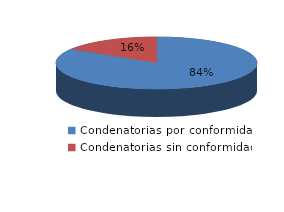
| Category | Series 0 |
|---|---|
| 0 | 764 |
| 1 | 147 |